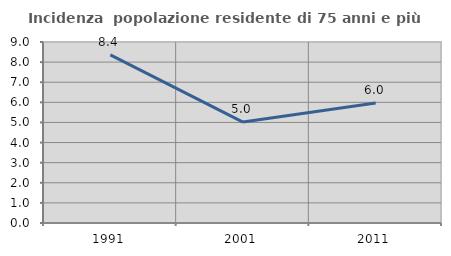
| Category | Incidenza  popolazione residente di 75 anni e più |
|---|---|
| 1991.0 | 8.36 |
| 2001.0 | 5.02 |
| 2011.0 | 5.969 |